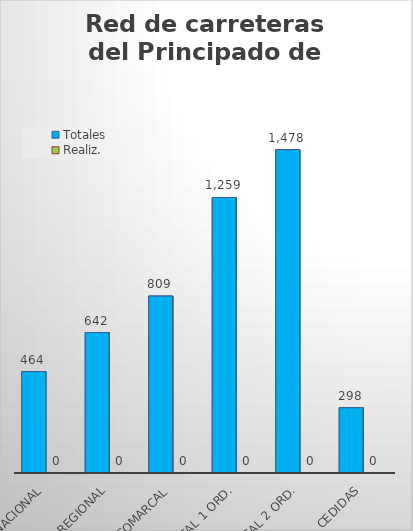
| Category | Totales | Realiz. |
|---|---|---|
| NACIONAL | 463.67 | 0 |
| REGIONAL | 642.065 | 0 |
| COMARCAL | 808.687 | 0 |
| Local 1 Ord. | 1259.443 | 0 |
| Local 2 Ord. | 1478.119 | 0 |
| Cedidas | 298.14 | 0 |